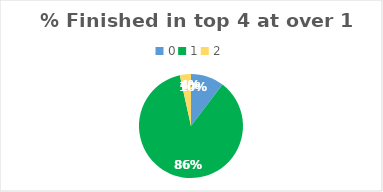
| Category | Series 0 |
|---|---|
| 0.0 | 0.103 |
| 1.0 | 0.862 |
| 2.0 | 0.034 |